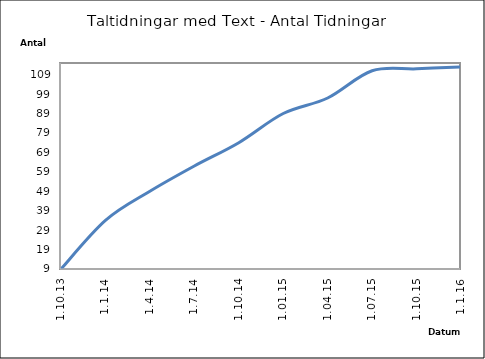
| Category | Series 0 |
|---|---|
| 1.10.13 | 9 |
| 1.1.14 | 34 |
| 1.4.14 | 49 |
| 1.7.14 | 62 |
| 1.10.14 | 74 |
| 1.01.15 | 89 |
| 1.04.15 | 97 |
| 1.07.15 | 111 |
| 1.10.15 | 112 |
| 1.1.16 | 113 |